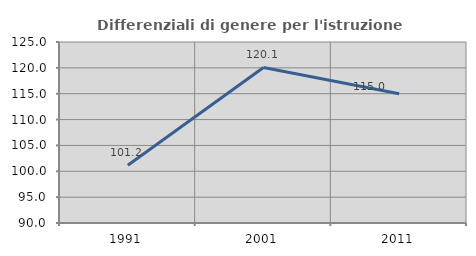
| Category | Differenziali di genere per l'istruzione superiore |
|---|---|
| 1991.0 | 101.168 |
| 2001.0 | 120.084 |
| 2011.0 | 114.991 |